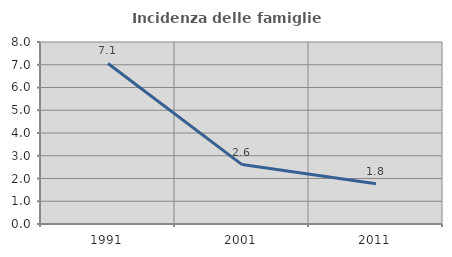
| Category | Incidenza delle famiglie numerose |
|---|---|
| 1991.0 | 7.057 |
| 2001.0 | 2.611 |
| 2011.0 | 1.766 |